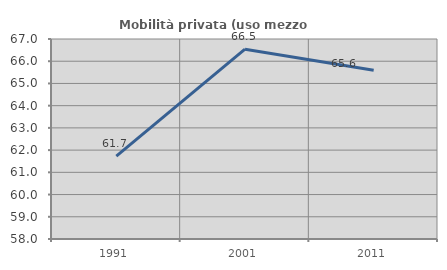
| Category | Mobilità privata (uso mezzo privato) |
|---|---|
| 1991.0 | 61.727 |
| 2001.0 | 66.542 |
| 2011.0 | 65.592 |